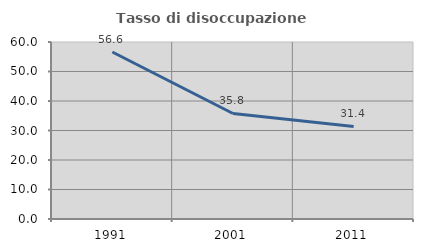
| Category | Tasso di disoccupazione giovanile  |
|---|---|
| 1991.0 | 56.6 |
| 2001.0 | 35.775 |
| 2011.0 | 31.368 |